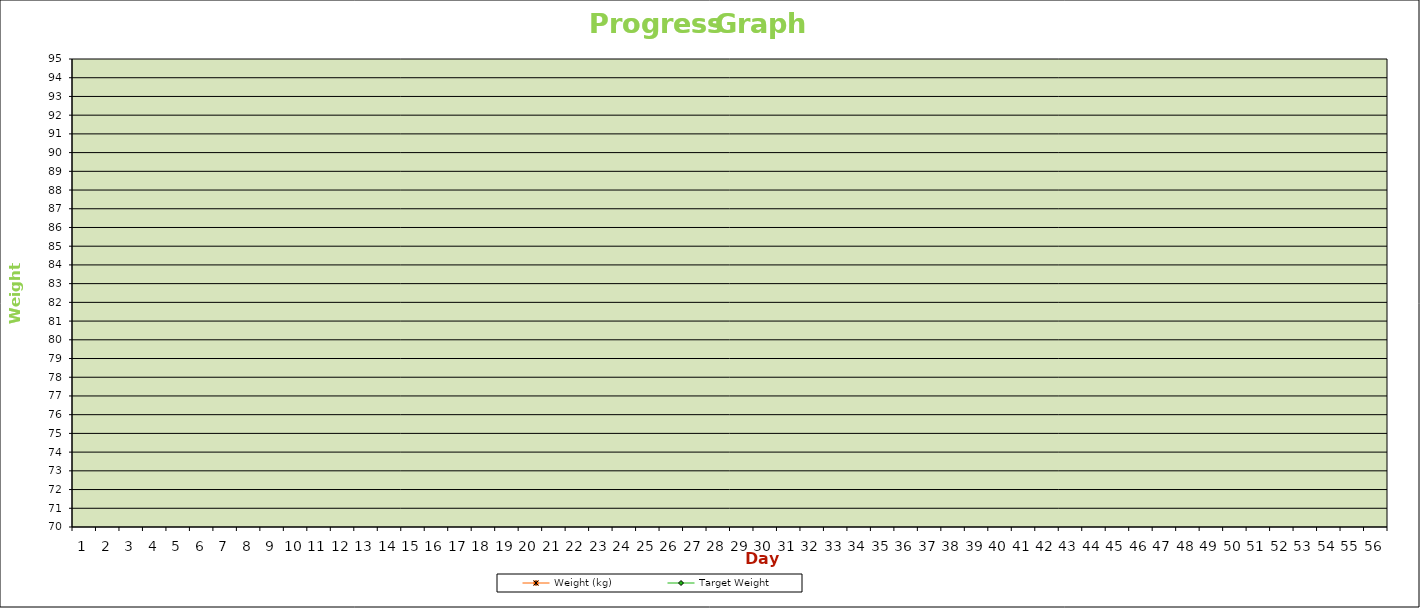
| Category | Weight (kg) | Target Weight |
|---|---|---|
| 0 | 0 | 0 |
| 1 | 0 | 0 |
| 2 | 0 | 0 |
| 3 | 0 | 0 |
| 4 | 0 | 0 |
| 5 | 0 | 0 |
| 6 | 0 | 0 |
| 7 | 0 | 0 |
| 8 | 0 | 0 |
| 9 | 0 | 0 |
| 10 | 0 | 0 |
| 11 | 0 | 0 |
| 12 | 0 | 0 |
| 13 | 0 | 0 |
| 14 | 0 | 0 |
| 15 | 0 | 0 |
| 16 | 0 | 0 |
| 17 | 0 | 0 |
| 18 | 0 | 0 |
| 19 | 0 | 0 |
| 20 | 0 | 0 |
| 21 | 0 | 0 |
| 22 | 0 | 0 |
| 23 | 0 | 0 |
| 24 | 0 | 0 |
| 25 | 0 | 0 |
| 26 | 0 | 0 |
| 27 | 0 | 0 |
| 28 | 0 | 0 |
| 29 | 0 | 0 |
| 30 | 0 | 0 |
| 31 | 0 | 0 |
| 32 | 0 | 0 |
| 33 | 0 | 0 |
| 34 | 0 | 0 |
| 35 | 0 | 0 |
| 36 | 0 | 0 |
| 37 | 0 | 0 |
| 38 | 0 | 0 |
| 39 | 0 | 0 |
| 40 | 0 | 0 |
| 41 | 0 | 0 |
| 42 | 0 | 0 |
| 43 | 0 | 0 |
| 44 | 0 | 0 |
| 45 | 0 | 0 |
| 46 | 0 | 0 |
| 47 | 0 | 0 |
| 48 | 0 | 0 |
| 49 | 0 | 0 |
| 50 | 0 | 0 |
| 51 | 0 | 0 |
| 52 | 0 | 0 |
| 53 | 0 | 0 |
| 54 | 0 | 0 |
| 55 | 0 | 0 |